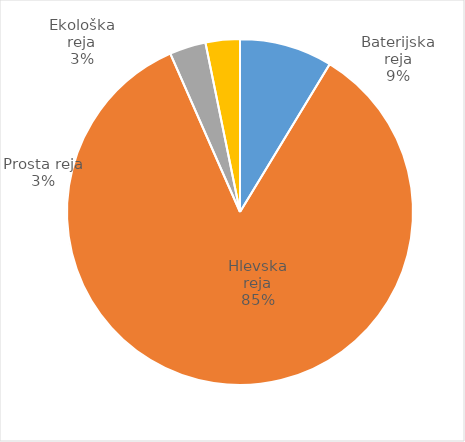
| Category | Število kosov jajc |
|---|---|
| Baterijska reja | 265330 |
| Hlevska reja | 2589642 |
| Prosta reja | 103677 |
| Ekološka reja | 98040 |